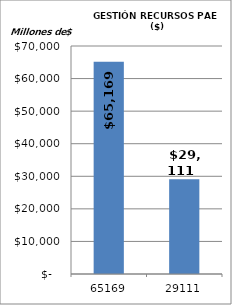
| Category | Series 0 |
|---|---|
| 65169.0 | 65169 |
| 29111.0 | 29111 |